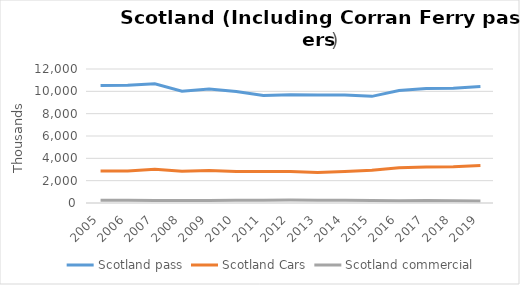
| Category | Scotland pass | Scotland Cars | Scotland commercial |
|---|---|---|---|
| 2005.0 | 10524.542 | 2862.47 | 245.259 |
| 2006.0 | 10539.161 | 2870.779 | 239.502 |
| 2007.0 | 10671.518 | 3014.08 | 229.592 |
| 2008.0 | 10012.33 | 2832.96 | 222.753 |
| 2009.0 | 10218.146 | 2910.115 | 224.58 |
| 2010.0 | 9990.742 | 2819.859 | 251.779 |
| 2011.0 | 9631.246 | 2816.776 | 254.277 |
| 2012.0 | 9698.268 | 2811.121 | 265.062 |
| 2013.0 | 9662.208 | 2727.078 | 245.647 |
| 2014.0 | 9678.145 | 2819.818 | 252.031 |
| 2015.0 | 9550.085 | 2923.516 | 222.399 |
| 2016.0 | 10073.057 | 3166.483 | 205.783 |
| 2017.0 | 10254.927 | 3233.591 | 232.414 |
| 2018.0 | 10279.283 | 3253.517 | 203.848 |
| 2019.0 | 10426.717 | 3348.222 | 186.467 |